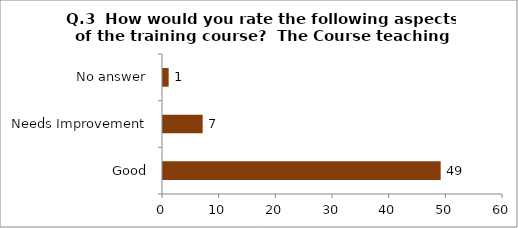
| Category | Q.3  How would you rate the following aspects of the training course?  |
|---|---|
| Good | 49 |
| Needs Improvement | 7 |
| No answer | 1 |